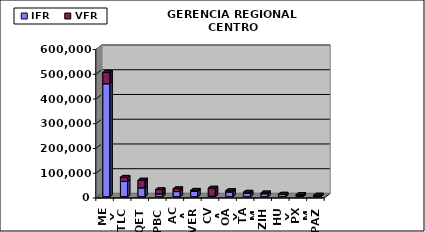
| Category | IFR | VFR |
|---|---|---|
| MEX | 456464 | 45688 |
| TLC | 61318 | 17090 |
| QET | 35722 | 31222 |
| PBC | 11112 | 17120 |
| ACA | 20515 | 11543 |
| VER | 21919 | 3978 |
| CVA | 1815 | 32703 |
| OAX | 19276 | 5132 |
| TAM | 13278 | 4754 |
| ZIH | 11952 | 3301 |
| HUX | 8533 | 1594 |
| PXM | 4642 | 4130 |
| PAZ | 1249 | 5019 |